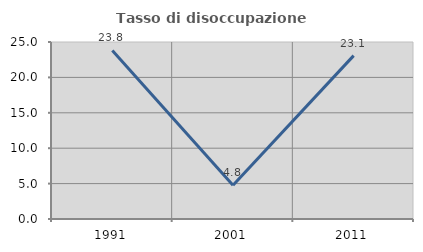
| Category | Tasso di disoccupazione giovanile  |
|---|---|
| 1991.0 | 23.81 |
| 2001.0 | 4.762 |
| 2011.0 | 23.077 |